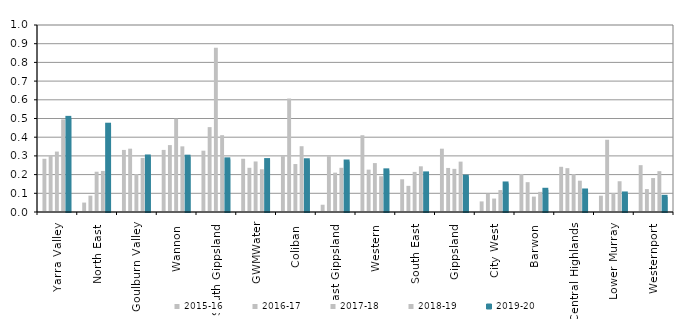
| Category | 2015-16 | 2016-17 | 2017-18 | 2018-19 | 2019-20 |
|---|---|---|---|---|---|
| Yarra Valley  | 0.285 | 0.302 | 0.323 | 0.495 | 0.503 |
| North East  | 0.05 | 0.088 | 0.215 | 0.22 | 0.467 |
| Goulburn Valley  | 0.332 | 0.339 | 0.203 | 0.289 | 0.297 |
| Wannon  | 0.332 | 0.358 | 0.499 | 0.351 | 0.296 |
| South Gippsland  | 0.328 | 0.454 | 0.879 | 0.411 | 0.282 |
| GWMWater | 0.285 | 0.236 | 0.27 | 0.229 | 0.278 |
| Coliban  | 0.299 | 0.607 | 0.257 | 0.352 | 0.277 |
| East Gippsland  | 0.039 | 0.298 | 0.21 | 0.236 | 0.27 |
| Western  | 0.411 | 0.227 | 0.262 | 0.191 | 0.223 |
| South East  | 0.175 | 0.14 | 0.214 | 0.244 | 0.206 |
| Gippsland  | 0.339 | 0.236 | 0.231 | 0.269 | 0.189 |
| City West  | 0.057 | 0.098 | 0.072 | 0.117 | 0.153 |
| Barwon  | 0.203 | 0.159 | 0.082 | 0.108 | 0.119 |
| Central Highlands  | 0.242 | 0.234 | 0.203 | 0.167 | 0.115 |
| Lower Murray  | 0.087 | 0.386 | 0.101 | 0.165 | 0.099 |
| Westernport  | 0.25 | 0.123 | 0.181 | 0.218 | 0.081 |